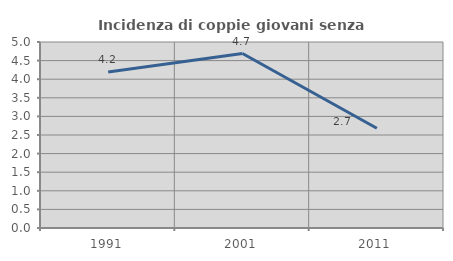
| Category | Incidenza di coppie giovani senza figli |
|---|---|
| 1991.0 | 4.192 |
| 2001.0 | 4.691 |
| 2011.0 | 2.68 |